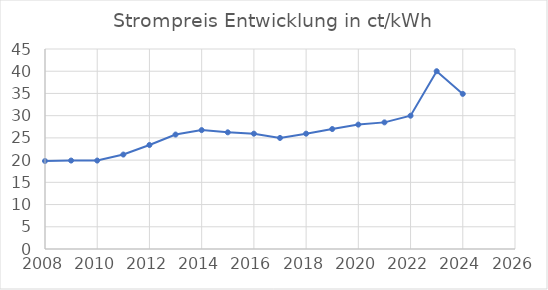
| Category | Strompreis Entwicklung in ct/kWh |
|---|---|
| 2008.0 | 19.8 |
| 2009.0 | 19.9 |
| 2010.0 | 19.9 |
| 2011.0 | 21.25 |
| 2012.0 | 23.4 |
| 2013.0 | 25.75 |
| 2014.0 | 26.75 |
| 2015.0 | 26.25 |
| 2016.0 | 25.95 |
| 2017.0 | 24.99 |
| 2018.0 | 25.95 |
| 2019.0 | 26.99 |
| 2020.0 | 27.99 |
| 2021.0 | 28.49 |
| 2022.0 | 29.99 |
| 2023.0 | 40 |
| 2024.0 | 34.9 |